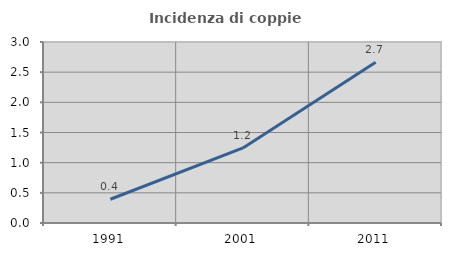
| Category | Incidenza di coppie miste |
|---|---|
| 1991.0 | 0.394 |
| 2001.0 | 1.244 |
| 2011.0 | 2.663 |